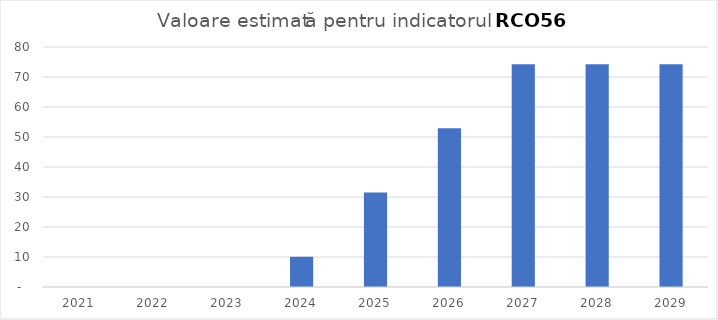
| Category | Series 0 |
|---|---|
| 2021.0 | 0 |
| 2022.0 | 0 |
| 2023.0 | 0 |
| 2024.0 | 10.073 |
| 2025.0 | 31.479 |
| 2026.0 | 52.885 |
| 2027.0 | 74.29 |
| 2028.0 | 74.29 |
| 2029.0 | 74.29 |